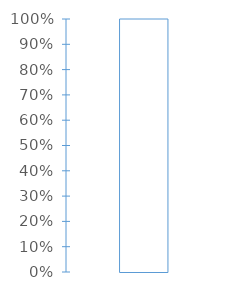
| Category | Achieved % |
|---|---|
| 0 | 0 |